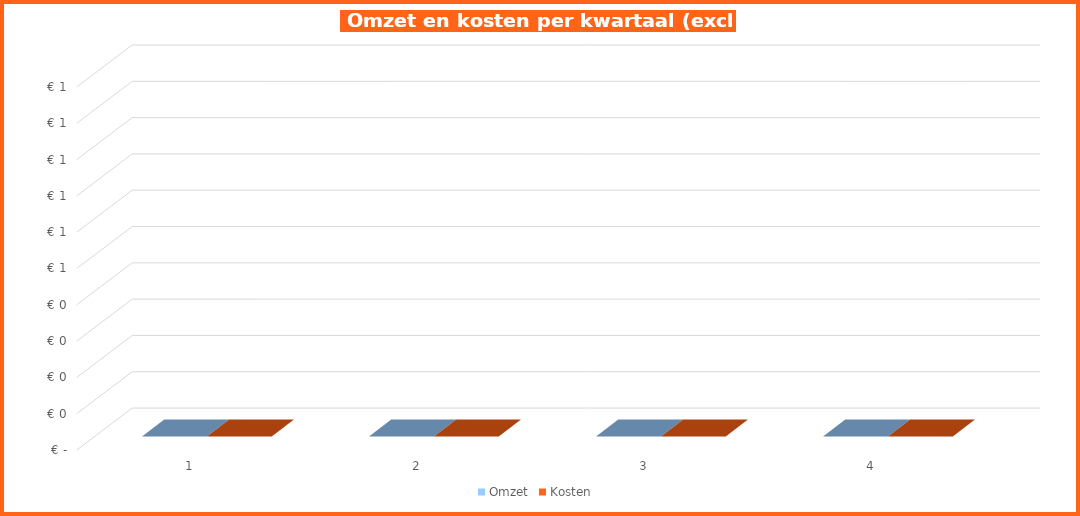
| Category | Omzet | Kosten |
|---|---|---|
| 0 | 0 | 0 |
| 1 | 0 | 0 |
| 2 | 0 | 0 |
| 3 | 0 | 0 |